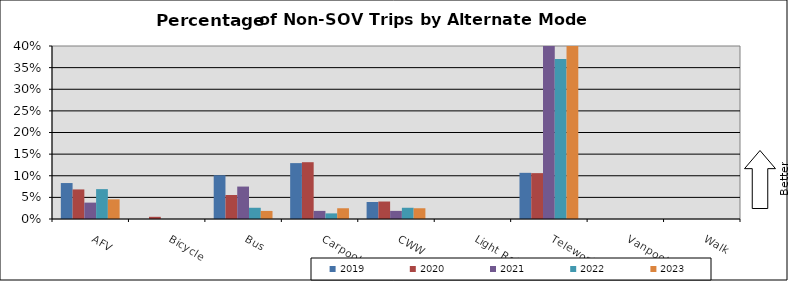
| Category | 2019 | 2020 | 2021 | 2022 | 2023 |
|---|---|---|---|---|---|
| AFV | 0.083 | 0.068 | 0.038 | 0.069 | 0.045 |
| Bicycle | 0 | 0.005 | 0 | 0 | 0 |
| Bus | 0.101 | 0.056 | 0.075 | 0.026 | 0.019 |
| Carpool | 0.129 | 0.131 | 0.019 | 0.013 | 0.025 |
| CWW | 0.039 | 0.04 | 0.019 | 0.026 | 0.025 |
| Light Rail | 0 | 0 | 0 | 0 | 0 |
| Telework | 0.107 | 0.106 | 0.556 | 0.37 | 0.609 |
| Vanpool | 0 | 0 | 0 | 0 | 0 |
| Walk | 0 | 0 | 0 | 0 | 0 |